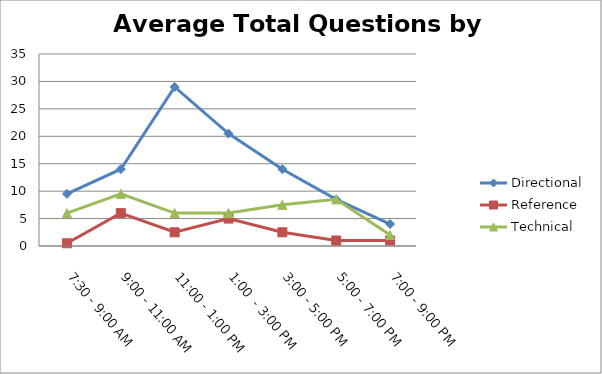
| Category | Directional | Reference | Technical |
|---|---|---|---|
| 7:30 - 9:00 AM | 9.5 | 0.5 | 6 |
| 9:00 - 11:00 AM | 14 | 6 | 9.5 |
| 11:00 - 1:00 PM | 29 | 2.5 | 6 |
| 1:00  - 3:00 PM | 20.5 | 5 | 6 |
| 3:00 - 5:00 PM | 14 | 2.5 | 7.5 |
| 5:00 - 7:00 PM | 8.5 | 1 | 8.5 |
| 7:00 - 9:00 PM | 4 | 1 | 2 |